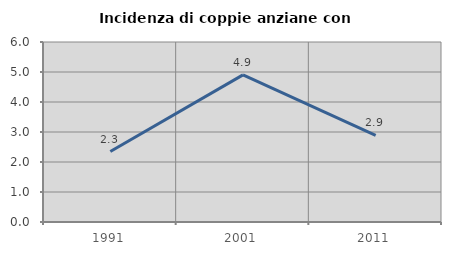
| Category | Incidenza di coppie anziane con figli |
|---|---|
| 1991.0 | 2.35 |
| 2001.0 | 4.905 |
| 2011.0 | 2.885 |